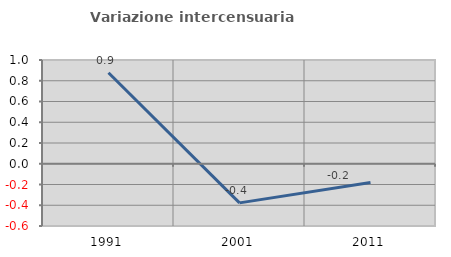
| Category | Variazione intercensuaria annua |
|---|---|
| 1991.0 | 0.877 |
| 2001.0 | -0.377 |
| 2011.0 | -0.181 |